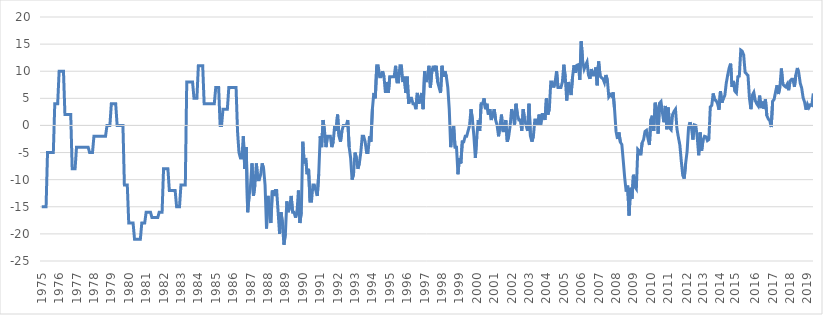
| Category | Forbrugertillidsindikatoren |
|---|---|
| 1975 | -15 |
|  | -15 |
|  | -15 |
|  | -15 |
|  | -5 |
|  | -5 |
|  | -5 |
|  | -5 |
|  | -5 |
|  | 4 |
|  | 4 |
|  | 4 |
| 1976 | 10 |
|  | 10 |
|  | 10 |
|  | 10 |
|  | 2 |
|  | 2 |
|  | 2 |
|  | 2 |
|  | 2 |
|  | -8 |
|  | -8 |
|  | -8 |
| 1977 | -4 |
|  | -4 |
|  | -4 |
|  | -4 |
|  | -4 |
|  | -4 |
|  | -4 |
|  | -4 |
|  | -4 |
|  | -5 |
|  | -5 |
|  | -5 |
| 1978 | -2 |
|  | -2 |
|  | -2 |
|  | -2 |
|  | -2 |
|  | -2 |
|  | -2 |
|  | -2 |
|  | -2 |
|  | 0 |
|  | 0 |
|  | 0 |
| 1979 | 4 |
|  | 4 |
|  | 4 |
|  | 4 |
|  | 0 |
|  | 0 |
|  | 0 |
|  | 0 |
|  | 0 |
|  | -11 |
|  | -11 |
|  | -11 |
| 1980 | -18 |
|  | -18 |
|  | -18 |
|  | -18 |
|  | -21 |
|  | -21 |
|  | -21 |
|  | -21 |
|  | -21 |
|  | -18 |
|  | -18 |
|  | -18 |
| 1981 | -16 |
|  | -16 |
|  | -16 |
|  | -16 |
|  | -17 |
|  | -17 |
|  | -17 |
|  | -17 |
|  | -17 |
|  | -16 |
|  | -16 |
|  | -16 |
| 1982 | -8 |
|  | -8 |
|  | -8 |
|  | -8 |
|  | -12 |
|  | -12 |
|  | -12 |
|  | -12 |
|  | -12 |
|  | -15 |
|  | -15 |
|  | -15 |
| 1983 | -11 |
|  | -11 |
|  | -11 |
|  | -11 |
|  | 8 |
|  | 8 |
|  | 8 |
|  | 8 |
|  | 8 |
|  | 5 |
|  | 5 |
|  | 5 |
| 1984 | 11 |
|  | 11 |
|  | 11 |
|  | 11 |
|  | 4 |
|  | 4 |
|  | 4 |
|  | 4 |
|  | 4 |
|  | 4 |
|  | 4 |
|  | 4 |
| 1985 | 7 |
|  | 7 |
|  | 7 |
|  | 0 |
|  | 0 |
|  | 3 |
|  | 3 |
|  | 3 |
|  | 3 |
|  | 7 |
|  | 7 |
|  | 7 |
| 1986 | 7 |
|  | 7 |
|  | 7 |
|  | -1 |
|  | -5 |
|  | -6 |
|  | -6 |
|  | -2 |
|  | -8 |
|  | -4 |
|  | -16 |
|  | -13 |
| 1987 | -11 |
|  | -7 |
|  | -13 |
|  | -11 |
|  | -7 |
|  | -10 |
|  | -10 |
|  | -9 |
|  | -7 |
|  | -8 |
|  | -11 |
|  | -19 |
| 1988 | -13 |
|  | -16 |
|  | -18 |
|  | -12 |
|  | -13 |
|  | -12 |
|  | -12 |
|  | -16 |
|  | -20 |
|  | -16 |
|  | -18 |
|  | -22 |
| 1989 | -20 |
|  | -14 |
|  | -16 |
|  | -15 |
|  | -13 |
|  | -16 |
|  | -16 |
|  | -17 |
|  | -16 |
|  | -12 |
|  | -18 |
|  | -16 |
| 1990 | -3 |
|  | -7 |
|  | -6 |
|  | -9 |
|  | -8 |
|  | -14 |
|  | -14 |
|  | -11 |
|  | -11 |
|  | -12 |
|  | -13 |
|  | -9 |
| 1991 | -2 |
|  | -4 |
|  | 1 |
|  | -1 |
|  | -4 |
|  | -2 |
|  | -2 |
|  | -2 |
|  | -4 |
|  | -3 |
|  | 0 |
|  | -1 |
| 1992 | 2 |
|  | -2 |
|  | -3 |
|  | -1 |
|  | 0 |
|  | 0 |
|  | 0 |
|  | 1 |
|  | -4 |
|  | -6 |
|  | -10 |
|  | -9 |
| 1993 | -5 |
|  | -6 |
|  | -8 |
|  | -7 |
|  | -5 |
|  | -2 |
|  | -2 |
|  | -3 |
|  | -5 |
|  | -5 |
|  | -2 |
|  | -3 |
| 1994 | 3 |
|  | 6 |
|  | 5 |
|  | 11 |
|  | 11 |
|  | 9 |
|  | 9 |
|  | 10 |
|  | 9 |
|  | 6 |
|  | 8 |
|  | 6 |
| 1995 | 9 |
|  | 9 |
|  | 9 |
|  | 9 |
|  | 11 |
|  | 8 |
|  | 8 |
|  | 11 |
|  | 11 |
|  | 8 |
|  | 9 |
|  | 6 |
| 1996 | 9 |
|  | 4 |
|  | 5 |
|  | 5 |
|  | 4 |
|  | 4 |
|  | 3 |
|  | 6 |
|  | 4 |
|  | 5 |
|  | 6 |
|  | 3 |
| 1997 | 10 |
|  | 8 |
|  | 9 |
|  | 11 |
|  | 7 |
|  | 10 |
|  | 11 |
|  | 10 |
|  | 11 |
|  | 8 |
|  | 7 |
|  | 6 |
| 1998 | 11 |
|  | 9 |
|  | 10 |
|  | 9 |
|  | 7 |
|  | 3 |
|  | -4 |
|  | -1 |
|  | 0 |
|  | -4 |
|  | -4 |
|  | -9 |
| 1999 | -6 |
|  | -7 |
|  | -3 |
|  | -3 |
|  | -2 |
|  | -2 |
|  | -1 |
|  | 0 |
|  | 3 |
|  | 1 |
|  | -2 |
|  | -6 |
| 2000 | -2 |
|  | 1 |
|  | -1 |
|  | 4 |
|  | 4 |
|  | 5 |
|  | 3 |
|  | 4 |
|  | 2 |
|  | 3 |
|  | 1 |
|  | 2 |
| 2001 | 3 |
|  | 1 |
|  | 0 |
|  | -2 |
|  | 0 |
|  | 2 |
|  | -1 |
|  | -1 |
|  | 1 |
|  | -3 |
|  | -2 |
|  | 0 |
| 2002 | 3 |
|  | 2 |
|  | 0 |
|  | 4 |
|  | 2 |
|  | 1 |
|  | 1 |
|  | -1 |
|  | 3 |
|  | 1 |
|  | 0 |
|  | -1 |
| 2003 | 4 |
|  | -2 |
|  | -3 |
|  | -2 |
|  | 1 |
|  | 1 |
|  | 0 |
|  | 2 |
|  | 0 |
|  | 2 |
|  | 2 |
|  | 1 |
| 2004 | 5 |
|  | 2 |
|  | 3 |
|  | 8 |
|  | 8 |
|  | 7 |
|  | 8 |
|  | 10 |
|  | 7 |
|  | 7 |
|  | 7 |
|  | 8 |
| 2005 | 11.2 |
|  | 8.9 |
|  | 4.6 |
|  | 8 |
|  | 7.1 |
|  | 5.6 |
|  | 8.9 |
|  | 11.1 |
|  | 9.7 |
|  | 11.1 |
|  | 11.2 |
|  | 8.4 |
| 2006 | 15.5 |
|  | 11.8 |
|  | 10.4 |
|  | 11.1 |
|  | 11.7 |
|  | 9.3 |
|  | 8.6 |
|  | 10.4 |
|  | 9.3 |
|  | 9.3 |
|  | 10.7 |
|  | 7.4 |
| 2007 | 11.8 |
|  | 9.2 |
|  | 8.8 |
|  | 8.6 |
|  | 7.9 |
|  | 9.3 |
|  | 8.4 |
|  | 5.3 |
|  | 5.7 |
|  | 5.4 |
|  | 6.1 |
|  | 2.9 |
| 2008 | -1.1 |
|  | -2.5 |
|  | -1.3 |
|  | -3.1 |
|  | -3.5 |
|  | -6.6 |
|  | -9.7 |
|  | -12.2 |
|  | -11.1 |
|  | -16.6 |
|  | -11.5 |
|  | -13.5 |
| 2009 | -9.1 |
|  | -11.3 |
|  | -11.7 |
|  | -4.4 |
|  | -4.7 |
|  | -5.5 |
|  | -3.2 |
|  | -2.6 |
|  | -1.1 |
|  | -0.9 |
|  | -2.4 |
|  | -3.6 |
| 2010 | 1.1 |
|  | 1.8 |
|  | -1 |
|  | 4.2 |
|  | 3 |
|  | -1.5 |
|  | 4.1 |
|  | 4.4 |
|  | 2.3 |
|  | 0.6 |
|  | 3.6 |
|  | -0.7 |
| 2011 | 3.3 |
|  | -0.5 |
|  | -0.8 |
|  | 2 |
|  | 2.6 |
|  | 3 |
|  | -0.6 |
|  | -2.2 |
|  | -3.6 |
|  | -6.6 |
|  | -9.2 |
|  | -9.8 |
|  | -7 |
| 2012 | -4.8 |
|  | -0.4 |
|  | 0.6 |
|  | -0.4 |
|  | -2.6 |
|  | 0.1 |
|  | 0 |
|  | -2.2 |
|  | -5.5 |
|  | -1.3 |
|  | -4.7 |
| 2013 | -2.7 |
|  | -2 |
|  | -2.1 |
|  | -2.8 |
|  | -2.6 |
|  | 3.4 |
|  | 3.7 |
|  | 5.9 |
|  | 4.7 |
|  | 4.6 |
|  | 4 |
|  | 2.9 |
| 2014 | 6.3 |
|  | 4.2 |
|  | 5 |
|  | 5.5 |
|  | 7.8 |
|  | 9.3 |
|  | 10.6 |
|  | 11.4 |
|  | 7.1 |
|  | 8.2 |
| 2015 | 6.3 |
|  | 6 |
|  | 9 |
|  | 9.1 |
|  | 13.9 |
|  | 13.7 |
|  | 13 |
|  | 9.8 |
|  | 9.5 |
|  | 9.2 |
|  | 5 |
|  | 3 |
|  | 5.6 |
|  | 6.1 |
| 2016 | 4.6 |
|  | 4 |
|  | 3.6 |
|  | 5.5 |
|  | 3.2 |
|  | 4.4 |
|  | 3.1 |
|  | 4.8 |
|  | 1.8 |
|  | 1.2 |
|  | 0.9 |
|  | -0.3 |
| 2017 | 4.5 |
|  | 4.8 |
|  | 6.2 |
|  | 7.4 |
|  | 5.8 |
|  | 7.1 |
|  | 10.5 |
|  | 7.6 |
|  | 7.3 |
|  | 7.1 |
|  | 7.6 |
|  | 6.5 |
| 2018 | 8.2 |
|  | 8.5 |
|  | 8.5 |
|  | 7.1 |
|  | 9.3 |
|  | 10.6 |
|  | 9.7 |
|  | 7.8 |
|  | 6.9 |
|  | 5.1 |
|  | 4.3 |
|  | 2.9 |
| 2019 | 3.9 |